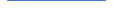
| Category | Series 0 |
|---|---|
| 0 | 89 |
| 1 | 77 |
| 2 | 73 |
| 3 | 48 |
| 4 | 61 |
| 5 | 86 |
| 6 | 63 |
| 7 | 65 |
| 8 | 72 |